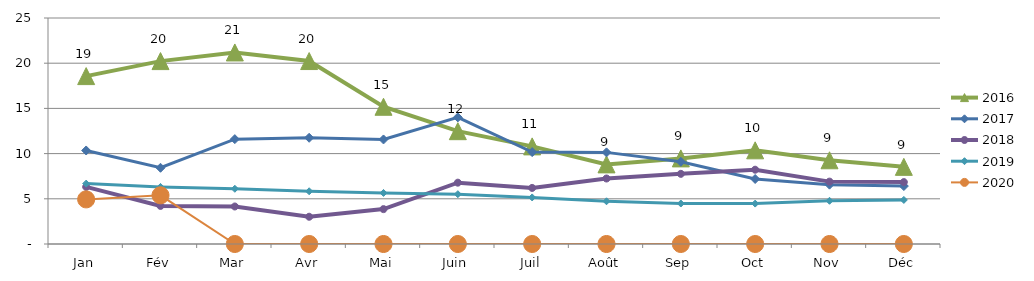
| Category | 2015 | 2016 | 2017 | 2018 | 2019 | 2020 |
|---|---|---|---|---|---|---|
| Jan |  | 18.573 | 10.345 | 6.315 | 6.68 | 4.936 |
| Fév |  | 20.232 | 8.433 | 4.213 | 6.315 | 5.385 |
| Mar |  | 21.188 | 11.601 | 4.15 | 6.109 | 0 |
| Avr |  | 20.238 | 11.751 | 3.014 | 5.832 | 0 |
| Mai |  | 15.18 | 11.565 | 3.859 | 5.648 | 0 |
| Juin |  | 12.479 | 14.003 | 6.784 | 5.512 | 0 |
| Juil |  | 10.799 | 10.166 | 6.203 | 5.152 | 0 |
| Août |  | 8.807 | 10.134 | 7.245 | 4.728 | 0 |
| Sep |  | 9.47 | 9.094 | 7.761 | 4.477 | 0 |
| Oct |  | 10.362 | 7.192 | 8.218 | 4.47 | 0 |
| Nov |  | 9.261 | 6.564 | 6.9 | 4.782 | 0 |
| Déc |  | 8.534 | 6.409 | 6.846 | 4.875 | 0 |